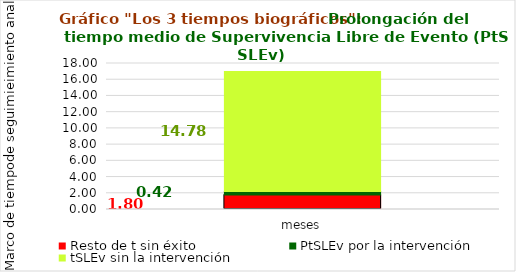
| Category | Resto de t sin éxito | PtSLEv por la intervención | tSLEv sin la intervención |
|---|---|---|---|
| meses | 1.8 | 0.417 | 14.783 |